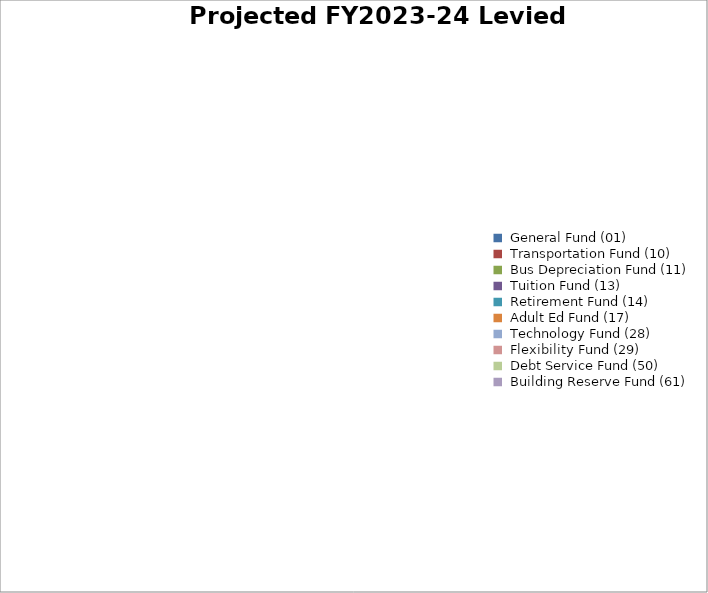
| Category | Series 0 |
|---|---|
|  General Fund (01)  | 0 |
|  Transportation Fund (10)  | 0 |
|  Bus Depreciation Fund (11)  | 0 |
|  Tuition Fund (13)  | 0 |
|  Retirement Fund (14)  | 0 |
|  Adult Ed Fund (17)  | 0 |
|  Technology Fund (28)  | 0 |
|  Flexibility Fund (29)  | 0 |
|  Debt Service Fund (50)   | 0 |
|  Building Reserve Fund (61)  | 0 |